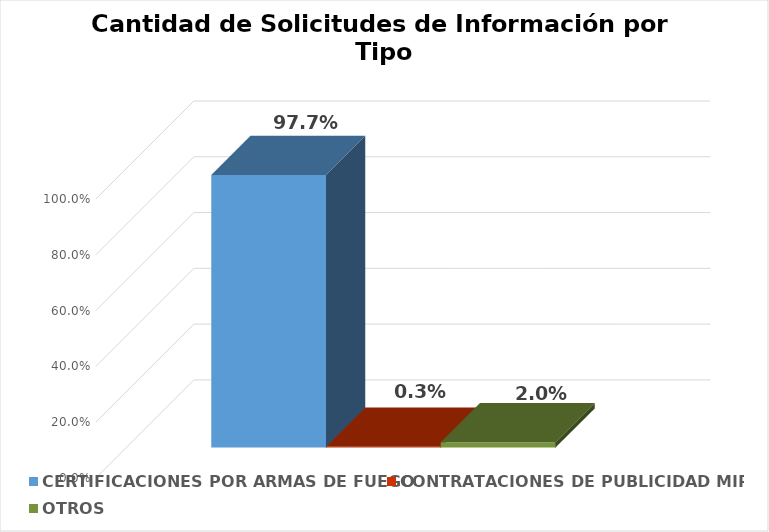
| Category | CERTIFICACIONES POR ARMAS DE FUEGO | CONTRATACIONES DE PUBLICIDAD MIP | OTROS |
|---|---|---|---|
|  | 0.977 | 0.003 | 0.02 |